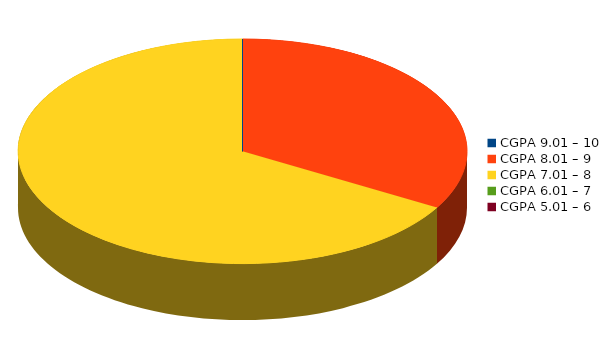
| Category | Number of students |
|---|---|
| CGPA 9.01 – 10 | 0 |
| CGPA 8.01 – 9 | 1 |
| CGPA 7.01 – 8 | 2 |
| CGPA 6.01 – 7 | 0 |
| CGPA 5.01 – 6 | 0 |